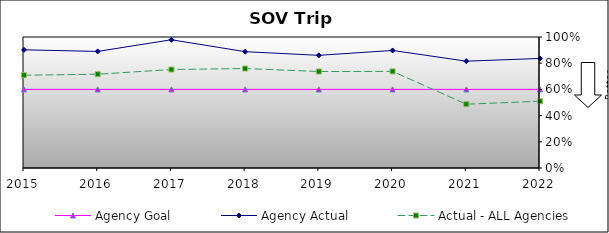
| Category | Agency Goal | Agency Actual | Actual - ALL Agencies |
|---|---|---|---|
| 2015.0 | 0.6 | 0.902 | 0.708 |
| 2016.0 | 0.6 | 0.89 | 0.716 |
| 2017.0 | 0.6 | 0.979 | 0.752 |
| 2018.0 | 0.6 | 0.888 | 0.759 |
| 2019.0 | 0.6 | 0.86 | 0.736 |
| 2020.0 | 0.6 | 0.897 | 0.737 |
| 2021.0 | 0.6 | 0.816 | 0.487 |
| 2022.0 | 0.6 | 0.836 | 0.509 |